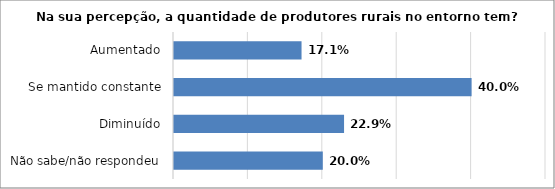
| Category | Series 0 |
|---|---|
| Não sabe/não respondeu | 0.2 |
| Diminuído | 0.229 |
| Se mantido constante | 0.4 |
| Aumentado | 0.171 |